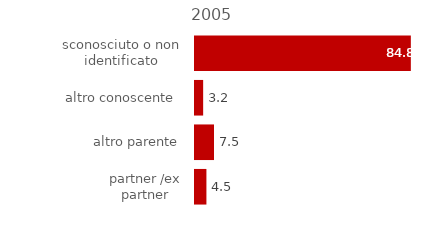
| Category | 2005 |
|---|---|
| partner /ex partner | 4.487 |
| altro parente | 7.479 |
| altro conoscente  | 3.205 |
| sconosciuto o non identificato | 84.829 |